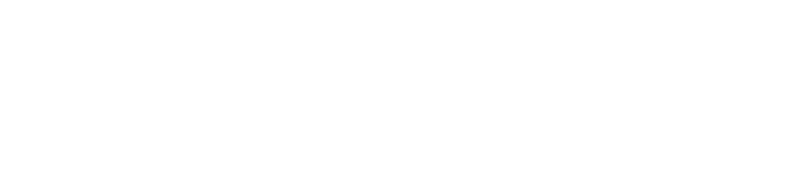
| Category | DISTRIBUCIÓN ZONA RIESGOS INHERENTES |
|---|---|
| BAJO | 0 |
| MEDIO | 0 |
| ALTO | 0 |
| CRITICO | 0 |